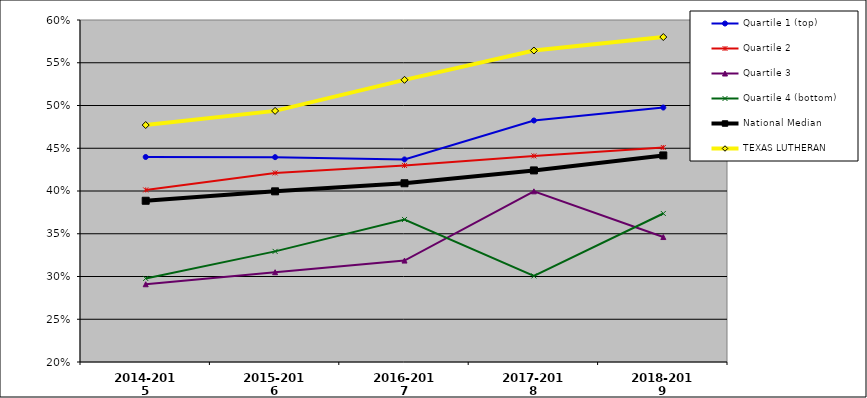
| Category | Quartile 1 (top) | Quartile 2 | Quartile 3 | Quartile 4 (bottom) | National Median | TEXAS LUTHERAN |
|---|---|---|---|---|---|---|
| 2014-2015 | 0.44 | 0.401 | 0.291 | 0.298 | 0.389 | 0.477 |
| 2015-2016 | 0.44 | 0.421 | 0.305 | 0.329 | 0.4 | 0.494 |
| 2016-2017 | 0.437 | 0.43 | 0.319 | 0.367 | 0.409 | 0.53 |
| 2017-2018 | 0.482 | 0.441 | 0.4 | 0.301 | 0.424 | 0.564 |
| 2018-2019 | 0.498 | 0.451 | 0.346 | 0.374 | 0.442 | 0.58 |